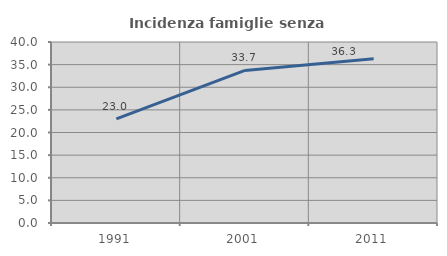
| Category | Incidenza famiglie senza nuclei |
|---|---|
| 1991.0 | 23.014 |
| 2001.0 | 33.718 |
| 2011.0 | 36.289 |